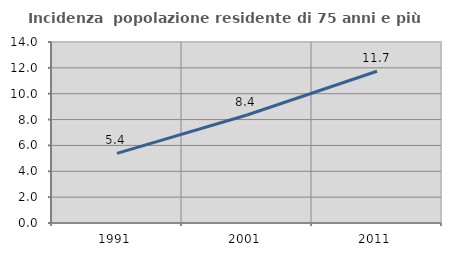
| Category | Incidenza  popolazione residente di 75 anni e più |
|---|---|
| 1991.0 | 5.385 |
| 2001.0 | 8.351 |
| 2011.0 | 11.734 |